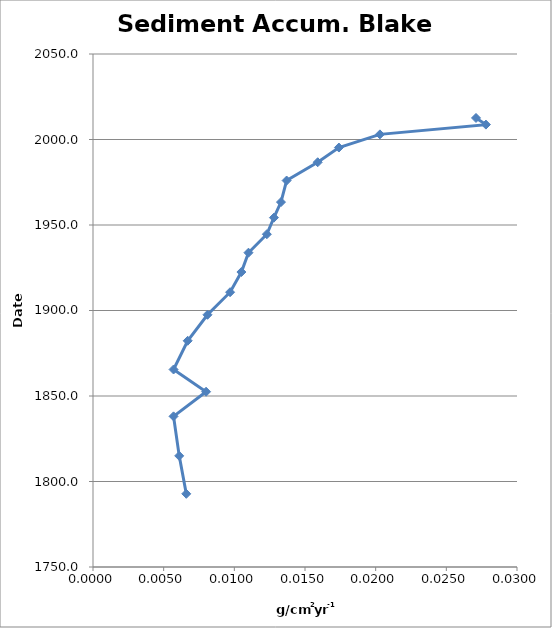
| Category | Sediment Accum. |
|---|---|
| 0.0271 | 2012.6 |
| 0.0278 | 2008.7 |
| 0.0203 | 2003 |
| 0.0174 | 1995.3 |
| 0.0159 | 1986.7 |
| 0.0137 | 1976 |
| 0.0133 | 1963.4 |
| 0.0128 | 1954.3 |
| 0.0123 | 1944.6 |
| 0.011 | 1933.8 |
| 0.0105 | 1922.5 |
| 0.0097 | 1910.7 |
| 0.0081 | 1897.5 |
| 0.0067 | 1882.3 |
| 0.0057 | 1865.5 |
| 0.008 | 1852.5 |
| 0.0057 | 1838.1 |
| 0.0061 | 1815 |
| 0.0066 | 1792.8 |